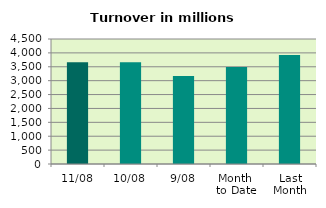
| Category | Series 0 |
|---|---|
| 11/08 | 3665.233 |
| 10/08 | 3662.387 |
| 9/08 | 3168.651 |
| Month 
to Date | 3494.84 |
| Last
Month | 3920.999 |